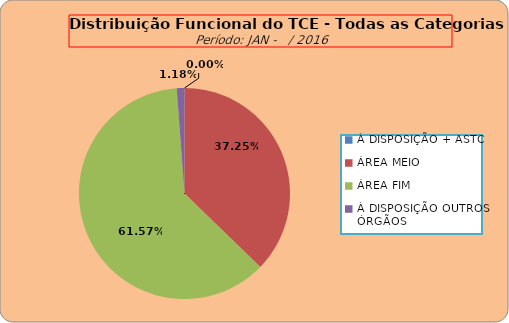
| Category | Series 0 |
|---|---|
| À DISPOSIÇÃO + ASTC | 0 |
| ÁREA MEIO | 190 |
| ÁREA FIM | 314 |
| À DISPOSIÇÃO OUTROS ÓRGÃOS | 6 |